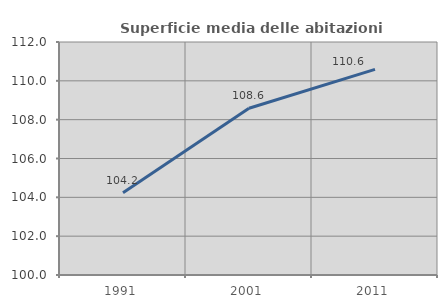
| Category | Superficie media delle abitazioni occupate |
|---|---|
| 1991.0 | 104.234 |
| 2001.0 | 108.588 |
| 2011.0 | 110.589 |